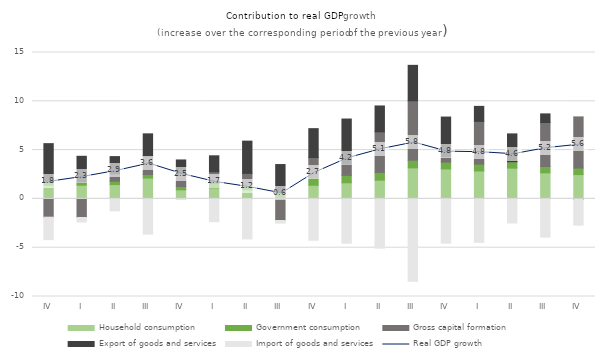
| Category | Household consumption | Government consumption | Gross capital formation | Export of goods and services | Import of goods and services |
|---|---|---|---|---|---|
| IV | 1.386 | 0.335 | -1.874 | 3.941 | -2.295 |
| I | 1.402 | 0.329 | -1.906 | 2.634 | -0.459 |
| II | 1.467 | 0.34 | 0.764 | 1.764 | -1.229 |
| III | 2.135 | 0.367 | 1.903 | 2.26 | -3.606 |
| IV | 0.929 | 0.336 | 1.285 | 1.44 | -0.008 |
| I | 1.141 | 0.44 | 1.206 | 1.629 | -2.336 |
| II | 0.926 | 0.511 | 1.177 | 3.304 | -4.103 |
| III | 0.112 | 0.611 | -2.216 | 2.797 | -0.267 |
| IV | 1.396 | 0.766 | 2.076 | 2.96 | -4.233 |
| I | 1.652 | 0.758 | 1.161 | 4.612 | -4.545 |
| II | 1.922 | 0.794 | 4.155 | 2.651 | -5.044 |
| III | 3.18 | 0.784 | 6.088 | 3.633 | -8.438 |
| IV | 3.071 | 0.696 | 0.589 | 4.03 | -4.53 |
| I | 2.86 | 0.7 | 4.385 | 1.535 | -4.456 |
| II | 3.151 | 0.661 | 0.001 | 2.849 | -2.464 |
| III | 2.673 | 0.646 | 4.511 | 0.88 | -3.915 |
| IV | 2.49 | 0.673 | 5.239 | -0.045 | -2.641 |